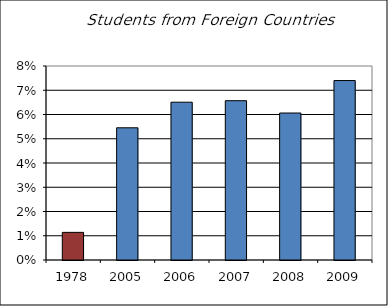
| Category | Foreign Countries |
|---|---|
| 1978.0 | 0.011 |
| 2005.0 | 0.055 |
| 2006.0 | 0.065 |
| 2007.0 | 0.066 |
| 2008.0 | 0.061 |
| 2009.0 | 0.074 |